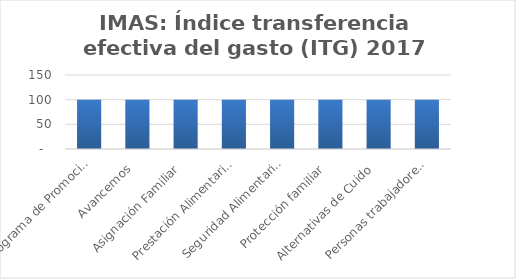
| Category | Índice transferencia efectiva del gasto (ITG) |
|---|---|
| Programa de Promoción y Protección Social | 100 |
| Avancemos | 100 |
| Asignación Familiar | 100 |
| Prestación Alimentaria | 100 |
| Seguridad Alimentaria | 100 |
| Protección familiar | 100 |
| Alternativas de Cuido | 100 |
| Personas trabajadores menores de edad | 100 |